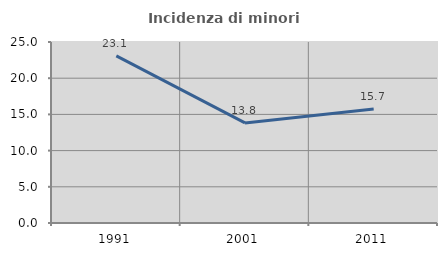
| Category | Incidenza di minori stranieri |
|---|---|
| 1991.0 | 23.077 |
| 2001.0 | 13.825 |
| 2011.0 | 15.732 |